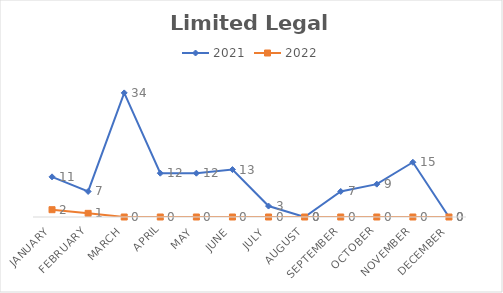
| Category | 2021 | 2022 |
|---|---|---|
| January | 11 | 2 |
| February | 7 | 1 |
| March | 34 | 0 |
| April | 12 | 0 |
| May | 12 | 0 |
| June | 13 | 0 |
| July | 3 | 0 |
| August | 0 | 0 |
| September | 7 | 0 |
| October | 9 | 0 |
| November | 15 | 0 |
| December | 0 | 0 |